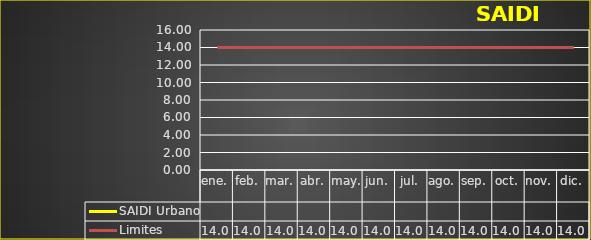
| Category | SAIDI Urbano | Limites |
|---|---|---|
| ene. |  | 14 |
| feb. |  | 14 |
| mar. |  | 14 |
| abr. |  | 14 |
| may. |  | 14 |
| jun. |  | 14 |
| jul. |  | 14 |
| ago. |  | 14 |
| sep. |  | 14 |
| oct. |  | 14 |
| nov. |  | 14 |
| dic. |  | 14 |